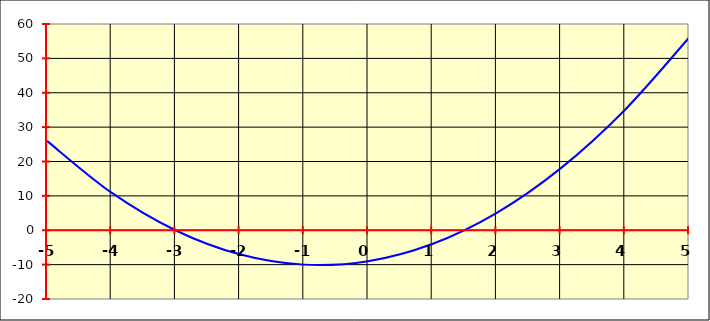
| Category | Series 0 |
|---|---|
| -5.0 | 26 |
| -4.0 | 11 |
| -3.0 | 0 |
| -2.0 | -7 |
| -1.0 | -10 |
| 0.0 | -9 |
| 1.0 | -4 |
| 2.0 | 5 |
| 3.0 | 18 |
| 4.0 | 35 |
| 5.0 | 56 |